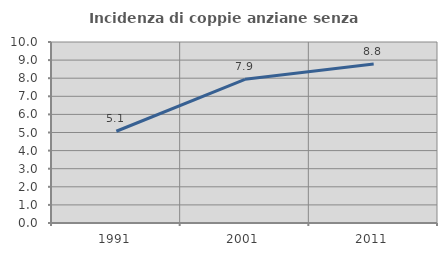
| Category | Incidenza di coppie anziane senza figli  |
|---|---|
| 1991.0 | 5.07 |
| 2001.0 | 7.94 |
| 2011.0 | 8.787 |